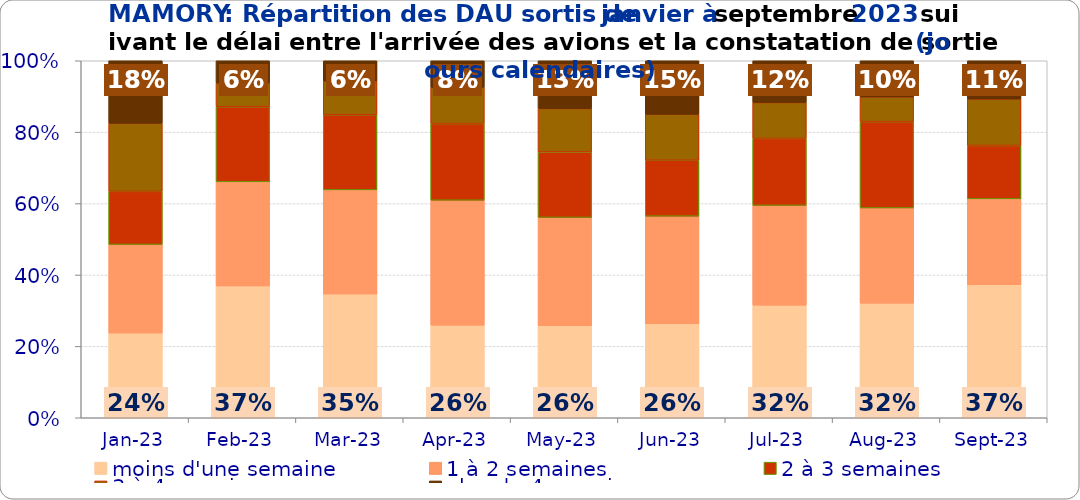
| Category | moins d'une semaine | 1 à 2 semaines | 2 à 3 semaines | 3 à 4 semaines | plus de 4 semaines |
|---|---|---|---|---|---|
| 2023-01-01 | 0.237 | 0.248 | 0.149 | 0.19 | 0.175 |
| 2023-02-01 | 0.369 | 0.292 | 0.21 | 0.066 | 0.062 |
| 2023-03-01 | 0.346 | 0.292 | 0.211 | 0.094 | 0.057 |
| 2023-04-01 | 0.259 | 0.35 | 0.215 | 0.101 | 0.075 |
| 2023-05-01 | 0.258 | 0.303 | 0.184 | 0.121 | 0.134 |
| 2023-06-01 | 0.263 | 0.302 | 0.157 | 0.129 | 0.15 |
| 2023-07-01 | 0.315 | 0.279 | 0.188 | 0.1 | 0.117 |
| 2023-08-01 | 0.321 | 0.267 | 0.242 | 0.069 | 0.101 |
| 2023-09-01 | 0.372 | 0.241 | 0.149 | 0.13 | 0.107 |